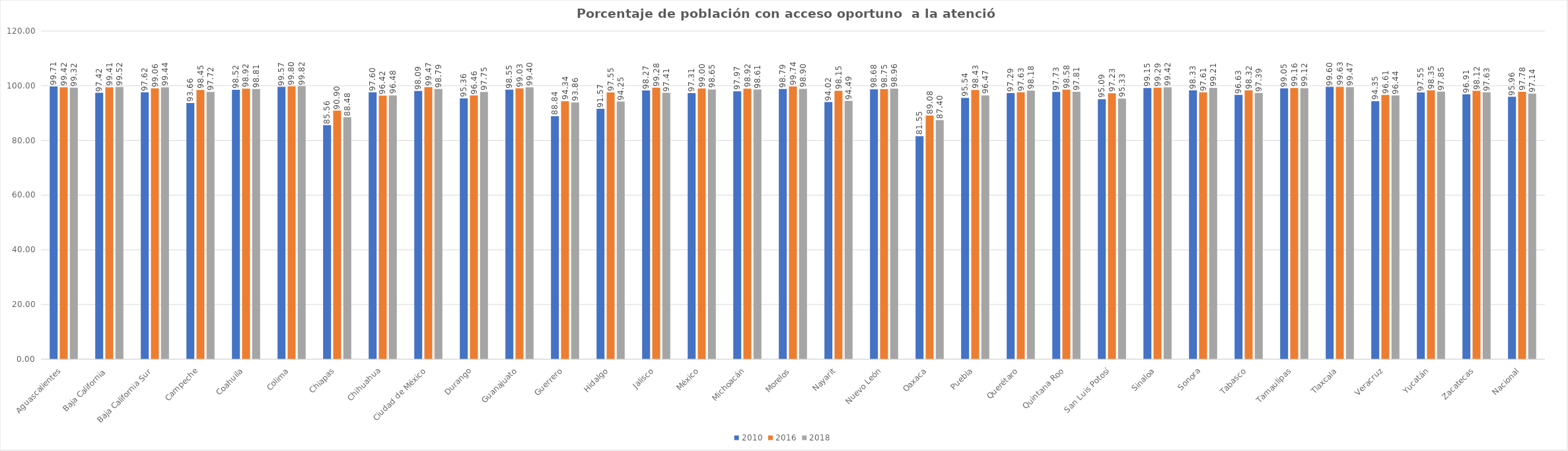
| Category | 2010 | 2016 | 2018 |
|---|---|---|---|
| Aguascalientes | 99.712 | 99.42 | 99.321 |
| Baja California | 97.422 | 99.409 | 99.524 |
| Baja California Sur | 97.618 | 99.056 | 99.438 |
| Campeche | 93.656 | 98.45 | 97.722 |
| Coahuila | 98.515 | 98.924 | 98.812 |
| Colima | 99.574 | 99.795 | 99.825 |
| Chiapas | 85.564 | 90.905 | 88.476 |
| Chihuahua | 97.596 | 96.423 | 96.478 |
| Ciudad de México | 98.091 | 99.47 | 98.791 |
| Durango | 95.357 | 96.455 | 97.753 |
| Guanajuato | 98.547 | 99.028 | 99.403 |
| Guerrero | 88.837 | 94.34 | 93.861 |
| Hidalgo | 91.569 | 97.55 | 94.246 |
| Jalisco | 98.269 | 99.28 | 97.407 |
| México | 97.305 | 98.998 | 98.653 |
| Michoacán | 97.972 | 98.923 | 98.607 |
| Morelos | 98.792 | 99.743 | 98.901 |
| Nayarit | 94.019 | 98.153 | 94.485 |
| Nuevo León | 98.677 | 98.747 | 98.964 |
| Oaxaca | 81.555 | 89.085 | 87.399 |
| Puebla | 95.539 | 98.431 | 96.469 |
| Querétaro | 97.287 | 97.629 | 98.181 |
| Quintana Roo | 97.728 | 98.577 | 97.813 |
| San Luis Potosí | 95.086 | 97.229 | 95.326 |
| Sinaloa | 99.155 | 99.292 | 99.423 |
| Sonora | 98.331 | 97.608 | 99.213 |
| Tabasco | 96.63 | 98.323 | 97.393 |
| Tamaulipas | 99.049 | 99.162 | 99.118 |
| Tlaxcala | 99.595 | 99.626 | 99.468 |
| Veracruz | 94.352 | 96.61 | 96.436 |
| Yucatán | 97.553 | 98.346 | 97.851 |
| Zacatecas | 96.906 | 98.125 | 97.631 |
| Nacional | 95.957 | 97.784 | 97.144 |